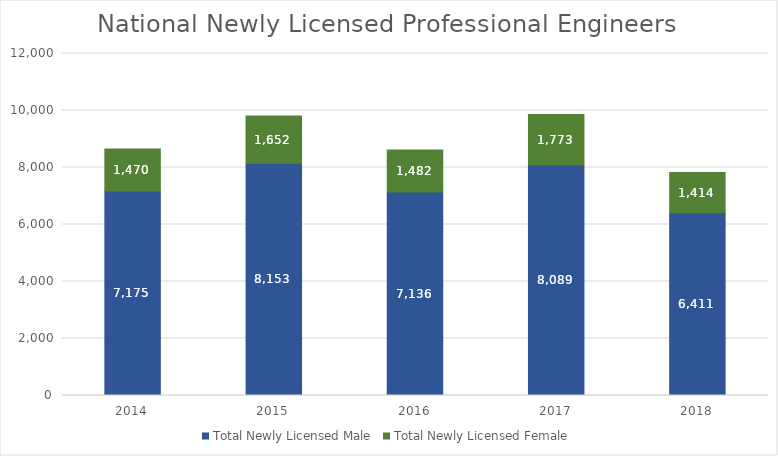
| Category | Total Newly Licensed Male | Total Newly Licensed Female |
|---|---|---|
| 2014.0 | 7175 | 1470 |
| 2015.0 | 8153 | 1652 |
| 2016.0 | 7136 | 1482 |
| 2017.0 | 8089 | 1773 |
| 2018.0 | 6411 | 1414 |